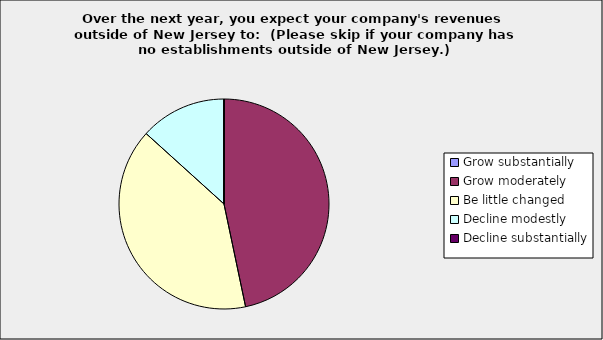
| Category | Series 0 |
|---|---|
| Grow substantially | 0 |
| Grow moderately | 0.467 |
| Be little changed | 0.4 |
| Decline modestly | 0.133 |
| Decline substantially | 0 |